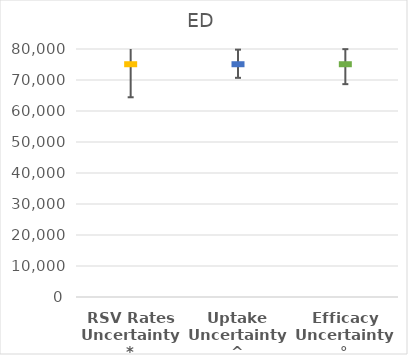
| Category | Series 0 |
|---|---|
| RSV Rates Uncertainty* | 75250 |
| Uptake Uncertainty^ | 75250 |
| Efficacy Uncertainty° | 75250 |